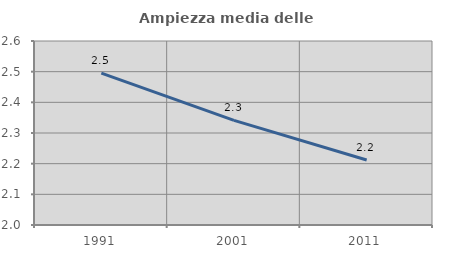
| Category | Ampiezza media delle famiglie |
|---|---|
| 1991.0 | 2.496 |
| 2001.0 | 2.341 |
| 2011.0 | 2.212 |